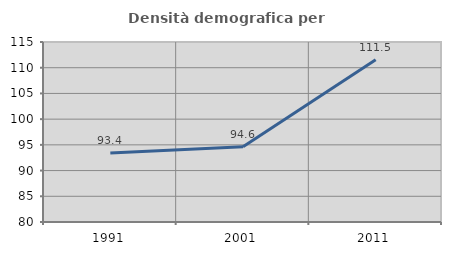
| Category | Densità demografica |
|---|---|
| 1991.0 | 93.434 |
| 2001.0 | 94.644 |
| 2011.0 | 111.547 |